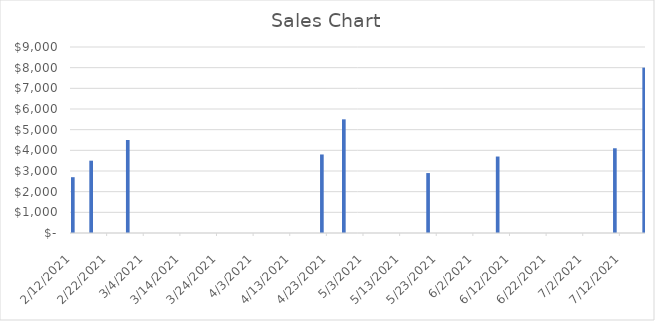
| Category | Sales Amount |
|---|---|
| 2/12/21 | 2700 |
| 2/17/21 | 3500 |
| 2/27/21 | 4500 |
| 4/21/21 | 3800 |
| 4/27/21 | 5500 |
| 5/20/21 | 2900 |
| 6/8/21 | 3700 |
| 7/10/21 | 4100 |
| 7/18/21 | 8000 |